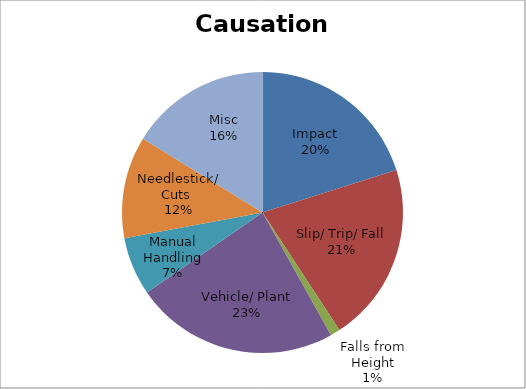
| Category | Series 0 |
|---|---|
| Impact | 0.201 |
| Slip/ Trip/ Fall | 0.207 |
| Falls from Height | 0.011 |
| Vehicle/ Plant | 0.235 |
| Manual Handling | 0.067 |
| Needlestick/ Cuts  | 0.117 |
| Misc | 0.162 |